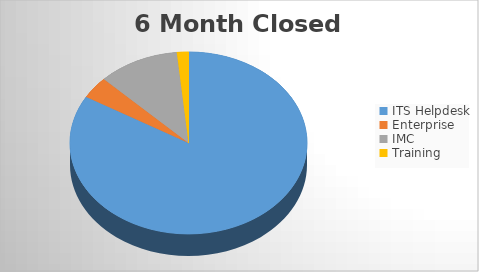
| Category | 6M Closed | 6M Opened |
|---|---|---|
| ITS Helpdesk | 1530 | 1544 |
| Enterprise | 72 | 69 |
| IMC | 203 | 200 |
| Training | 29 | 34 |